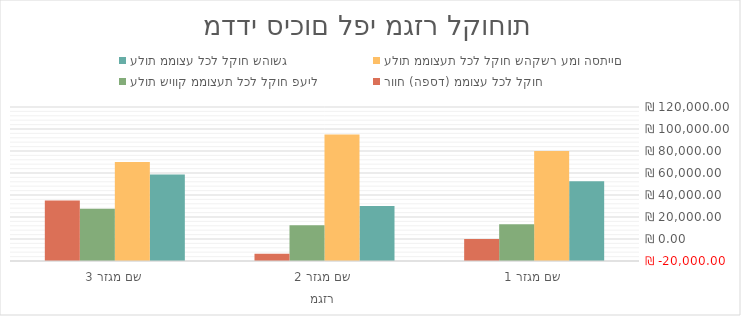
| Category | עלות ממוצע לכל לקוח שהושג | עלות ממוצעת לכל לקוח שהקשר עמו הסתיים | עלות שיווק ממוצעת לכל לקוח פעיל | רווח (הפסד) ממוצע לכל לקוח |
|---|---|---|---|---|
| שם מגזר 1 | 52500 | 80000 | 13333.333 | 0 |
| שם מגזר 2 | 30000 | 95000 | 12500 | -13500 |
| שם מגזר 3 | 58750 | 70000 | 27500 | 35000 |